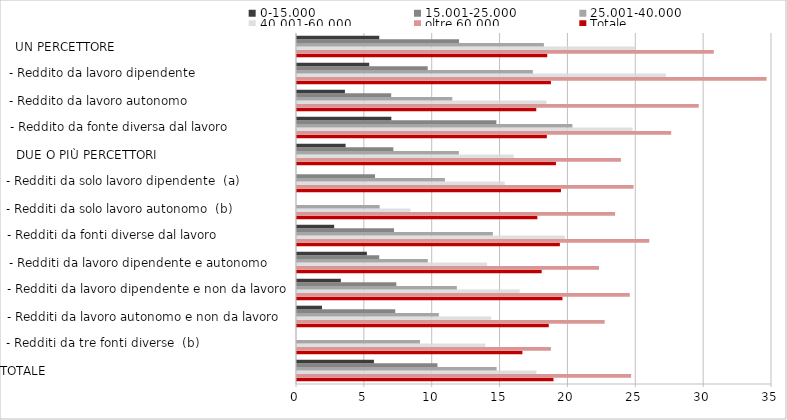
| Category | Totale | oltre 60.000 | 40.001-60.000 | 25.001-40.000 | 15.001-25.000 | 0-15.000 |
|---|---|---|---|---|---|---|
| TOTALE                                                                | 18.9 | 24.62 | 17.64 | 14.71 | 10.35 | 5.67 |
| - Redditi da tre fonti diverse  (b)                        | 16.61 | 18.71 | 13.89 | 9.06 | 0 | 0 |
| - Redditi da lavoro autonomo e non da lavoro   | 18.55 | 22.67 | 14.31 | 10.45 | 7.24 | 1.84 |
| - Redditi da lavoro dipendente e non da lavoro | 19.56 | 24.52 | 16.41 | 11.78 | 7.32 | 3.23 |
| - Redditi da lavoro dipendente e autonomo      | 18.03 | 22.25 | 14.01 | 9.64 | 6.06 | 5.15 |
| - Redditi da fonti diverse dal lavoro                   | 19.37 | 25.96 | 19.74 | 14.43 | 7.15 | 2.74 |
| - Redditi da solo lavoro autonomo  (b)               | 17.71 | 23.44 | 8.36 | 6.09 | 0 | 0 |
| - Redditi da solo lavoro dipendente  (a)             | 19.45 | 24.8 | 15.31 | 10.9 | 5.75 | 0 |
| DUE O PIÙ PERCETTORI                                   | 19.08 | 23.87 | 15.97 | 11.93 | 7.1 | 3.58 |
| - Reddito da fonte diversa dal lavoro                | 18.41 | 27.57 | 24.73 | 20.29 | 14.69 | 6.95 |
| - Reddito da lavoro autonomo                           | 17.63 | 29.6 | 18.38 | 11.44 | 6.94 | 3.53 |
| - Reddito da lavoro dipendente                         | 18.71 | 34.6 | 27.18 | 17.38 | 9.63 | 5.32 |
| UN PERCETTORE                                              | 18.44 | 30.71 | 24.97 | 18.19 | 11.94 | 6.06 |